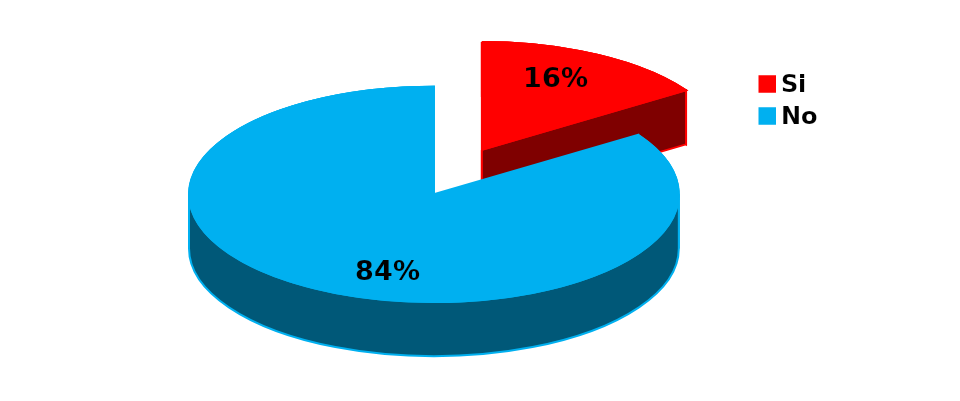
| Category | Series 0 |
|---|---|
| Si | 16 |
| No | 86 |